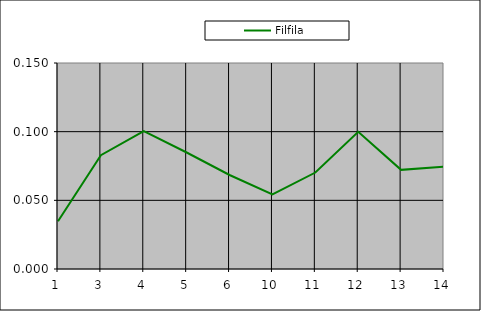
| Category | Filfila |
|---|---|
| 1.0 | 0.035 |
| 3.0 | 0.083 |
| 4.0 | 0.1 |
| 5.0 | 0.085 |
| 6.0 | 0.068 |
| 10.0 | 0.054 |
| 11.0 | 0.07 |
| 12.0 | 0.1 |
| 13.0 | 0.072 |
| 14.0 | 0.074 |